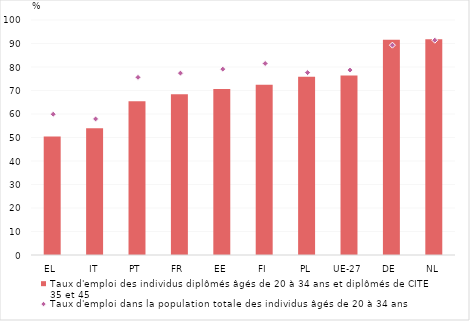
| Category | Taux d'emploi des individus diplômés âgés de 20 à 34 ans et diplômés de CITE 35 et 45  |
|---|---|
| EL | 50.4 |
| IT | 53.9 |
| PT | 65.4 |
| FR | 68.4 |
| EE | 70.6 |
| FI | 72.4 |
| PL | 75.8 |
| UE-27 | 76.4 |
| DE | 91.6 |
| NL | 91.8 |